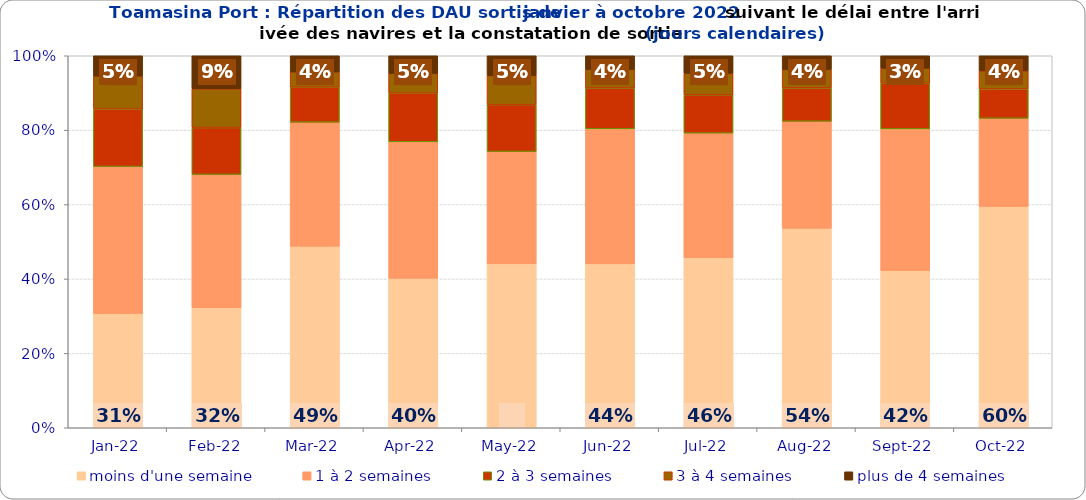
| Category | moins d'une semaine | 1 à 2 semaines | 2 à 3 semaines | 3 à 4 semaines | plus de 4 semaines |
|---|---|---|---|---|---|
| 2022-01-01 | 0.307 | 0.395 | 0.155 | 0.088 | 0.055 |
| 2022-02-01 | 0.323 | 0.358 | 0.126 | 0.104 | 0.089 |
| 2022-03-01 | 0.488 | 0.334 | 0.094 | 0.041 | 0.044 |
| 2022-04-01 | 0.402 | 0.367 | 0.131 | 0.053 | 0.048 |
| 2022-05-01 | 0.441 | 0.302 | 0.126 | 0.078 | 0.054 |
| 2022-06-01 | 0.441 | 0.363 | 0.109 | 0.05 | 0.037 |
| 2022-07-01 | 0.457 | 0.335 | 0.103 | 0.058 | 0.047 |
| 2022-08-01 | 0.536 | 0.288 | 0.09 | 0.05 | 0.037 |
| 2022-09-01 | 0.422 | 0.381 | 0.123 | 0.04 | 0.033 |
| 2022-10-01 | 0.595 | 0.237 | 0.079 | 0.048 | 0.041 |